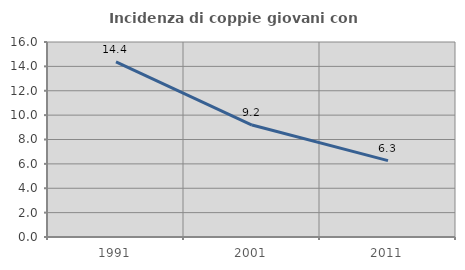
| Category | Incidenza di coppie giovani con figli |
|---|---|
| 1991.0 | 14.374 |
| 2001.0 | 9.184 |
| 2011.0 | 6.263 |